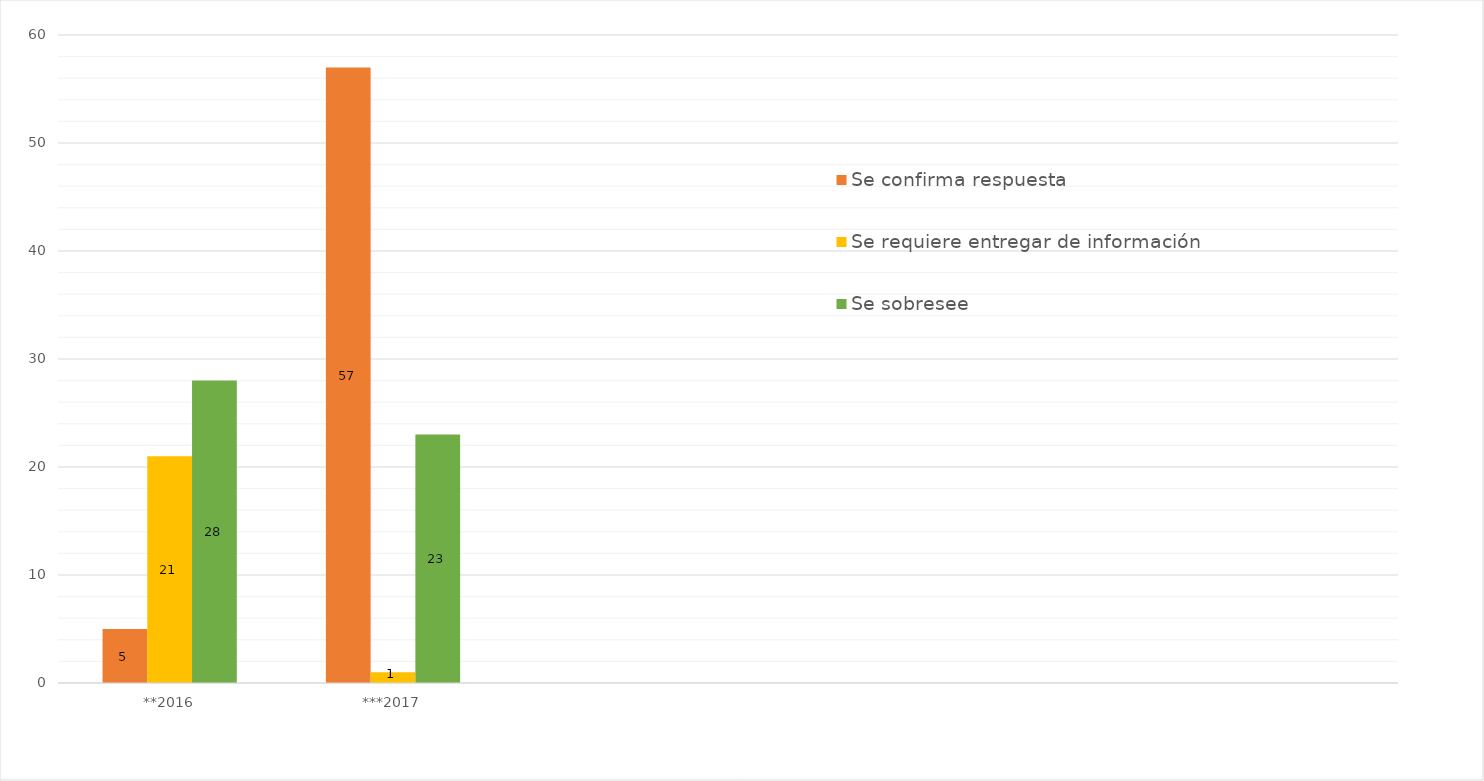
| Category | Se confirma respuesta | Se requiere entregar de información  | Se sobresee  |
|---|---|---|---|
| **2016 | 5 | 21 | 28 |
| ***2017 | 57 | 1 | 23 |